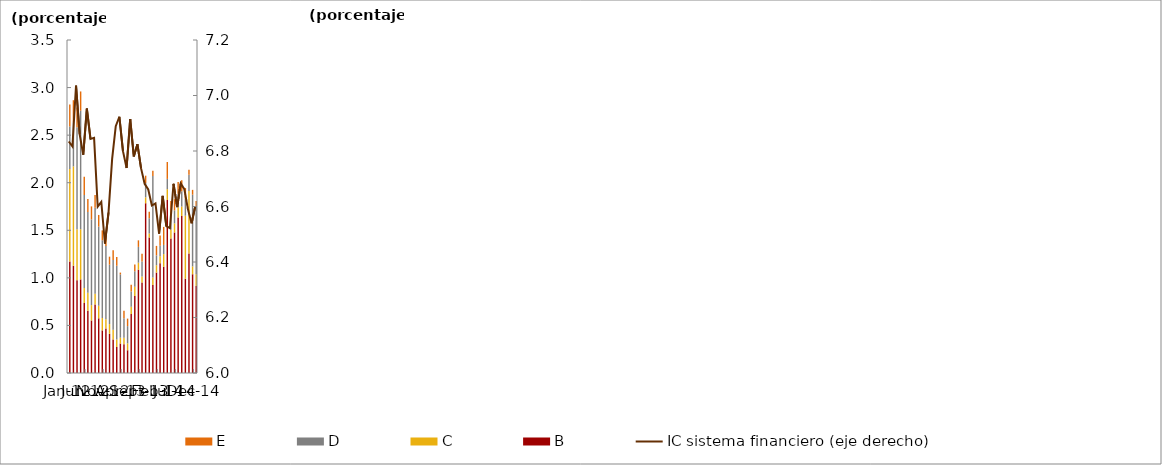
| Category | B | C | D | E |
|---|---|---|---|---|
| 2012-01-31 | 1.171 | 0.974 | 0.446 | 0.231 |
| 2012-02-29 | 1.127 | 1.044 | 0.463 | 0.233 |
| 2012-03-31 | 0.976 | 0.534 | 1.073 | 0.208 |
| 2012-04-30 | 0.983 | 0.527 | 1.246 | 0.202 |
| 2012-05-31 | 0.737 | 0.156 | 0.978 | 0.191 |
| 2012-06-30 | 0.654 | 0.189 | 0.849 | 0.135 |
| 2012-07-31 | 0.552 | 0.161 | 0.901 | 0.136 |
| 2012-08-31 | 0.719 | 0.113 | 0.904 | 0.135 |
| 2012-09-30 | 0.575 | 0.132 | 0.831 | 0.123 |
| 2012-10-31 | 0.448 | 0.13 | 0.817 | 0.104 |
| 2012-11-30 | 0.467 | 0.098 | 0.77 | 0.105 |
| 2012-12-31 | 0.411 | 0.103 | 0.625 | 0.084 |
| 2013-01-31 | 0.353 | 0.103 | 0.732 | 0.102 |
| 2013-02-28 | 0.273 | 0.079 | 0.774 | 0.092 |
| 2013-03-31 | 0.31 | 0.061 | 0.665 | 0.019 |
| 2013-04-30 | 0.302 | 0.068 | 0.205 | 0.08 |
| 2013-05-31 | 0.239 | 0.073 | 0.181 | 0.079 |
| 2013-06-30 | 0.621 | 0.076 | 0.158 | 0.071 |
| 2013-07-31 | 0.808 | 0.097 | 0.163 | 0.072 |
| 2013-08-31 | 1.086 | 0.073 | 0.166 | 0.069 |
| 2013-09-30 | 0.952 | 0.064 | 0.156 | 0.082 |
| 2013-10-31 | 1.784 | 0.062 | 0.15 | 0.077 |
| 2013-11-30 | 1.423 | 0.043 | 0.161 | 0.068 |
| 2013-12-31 | 0.925 | 0.079 | 1.066 | 0.055 |
| 2014-01-31 | 1.056 | 0.077 | 0.104 | 0.1 |
| 2014-02-28 | 1.153 | 0.073 | 0.111 | 0.108 |
| 2014-03-31 | 1.116 | 0.134 | 0.096 | 0.189 |
| 2014-04-30 | 1.818 | 0.114 | 0.108 | 0.177 |
| 2014-05-31 | 1.413 | 0.095 | 0.151 | 0.148 |
| 2014-06-30 | 1.477 | 0.096 | 0.137 | 0.118 |
| 2014-07-31 | 1.634 | 0.107 | 0.144 | 0.121 |
| 2014-08-31 | 1.651 | 0.1 | 0.159 | 0.117 |
| 2014-09-30 | 0.991 | 0.662 | 0.179 | 0.112 |
| 2014-10-31 | 1.257 | 0.657 | 0.169 | 0.054 |
| 2014-11-30 | 1.038 | 0.082 | 0.754 | 0.051 |
| 2014-12-31 | 0.916 | 0.122 | 0.718 | 0.052 |